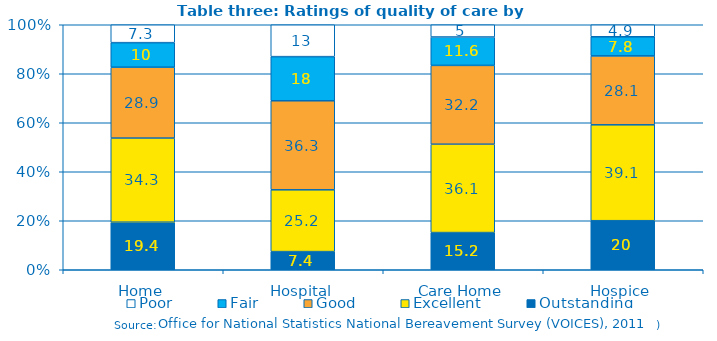
| Category | Outstanding | Excellent | Good | Fair | Poor |
|---|---|---|---|---|---|
| Home | 19.4 | 34.3 | 28.9 | 10 | 7.3 |
| Hospital | 7.4 | 25.2 | 36.3 | 18 | 13 |
| Care Home | 15.2 | 36.1 | 32.2 | 11.6 | 5 |
| Hospice | 20 | 39.1 | 28.1 | 7.8 | 4.9 |